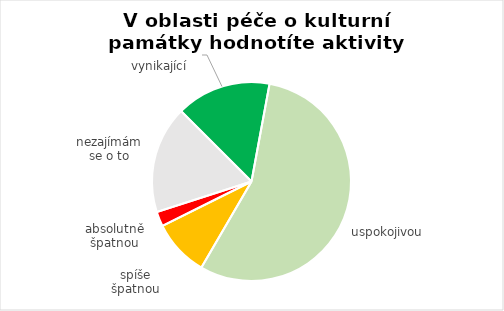
| Category | Series 0 |
|---|---|
| vynikající | 45 |
| uspokojivou | 162 |
| spíše špatnou | 27 |
| absolutně špatnou | 7 |
| nezajímám se o to | 51 |